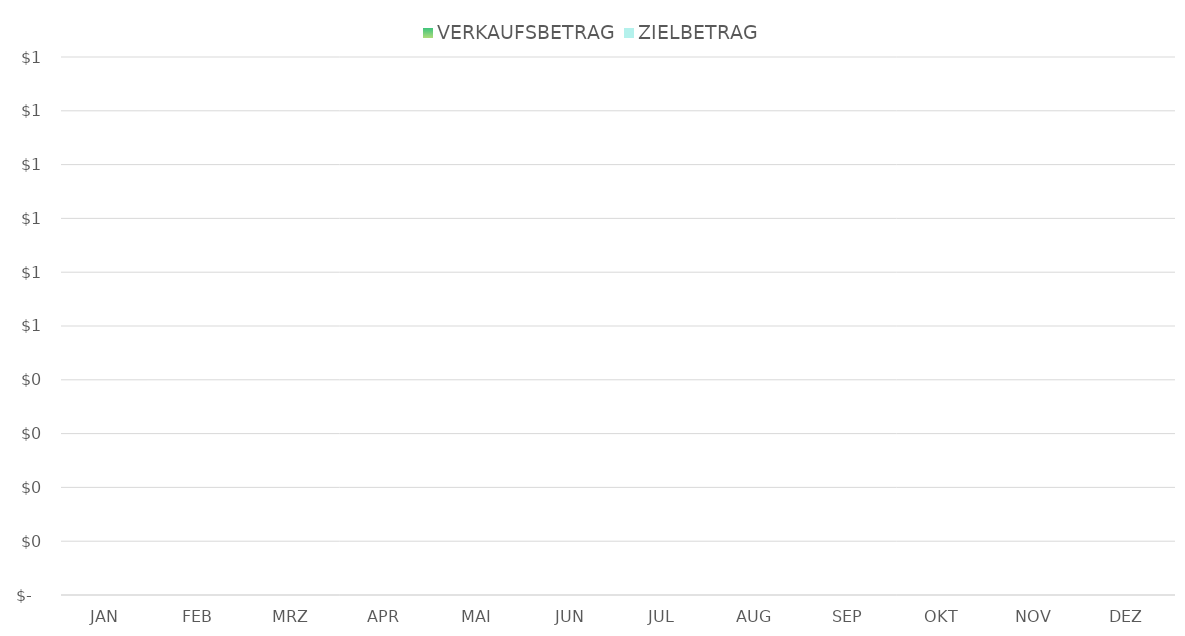
| Category | VERKAUFSBETRAG | ZIELBETRAG |
|---|---|---|
| JAN | 0 | 0 |
| FEB | 0 | 0 |
| MRZ | 0 | 0 |
| APR | 0 | 0 |
| MAI | 0 | 0 |
| JUN | 0 | 0 |
| JUL | 0 | 0 |
| AUG | 0 | 0 |
| SEP | 0 | 0 |
| OKT | 0 | 0 |
| NOV | 0 | 0 |
| DEZ | 0 | 0 |